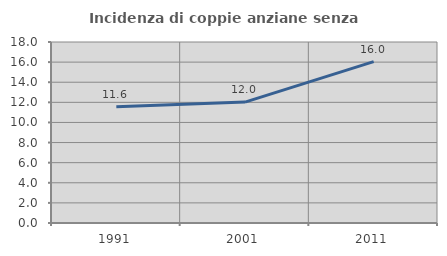
| Category | Incidenza di coppie anziane senza figli  |
|---|---|
| 1991.0 | 11.565 |
| 2001.0 | 12.025 |
| 2011.0 | 16.049 |